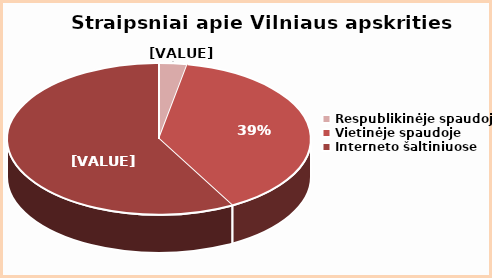
| Category | Series 0 |
|---|---|
| Respublikinėje spaudoje | 3 |
| Vietinėje spaudoje | 39 |
| Interneto šaltiniuose | 58 |